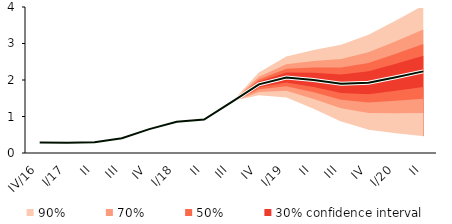
| Category | linka | Centerline |
|---|---|---|
| IV/16 | 0.289 | 0.289 |
| I/17 | 0.28 | 0.28 |
| II | 0.294 | 0.294 |
| III | 0.402 | 0.402 |
| IV | 0.654 | 0.654 |
| I/18 | 0.857 | 0.857 |
| II | 0.916 | 0.916 |
| III | 1.393 | 1.393 |
| IV | 1.879 | 1.879 |
| I/19 | 2.07 | 2.07 |
| II | 2.001 | 2.001 |
| III | 1.9 | 1.9 |
| IV | 1.925 | 1.925 |
| I/20 | 2.075 | 2.075 |
| II | 2.237 | 2.237 |